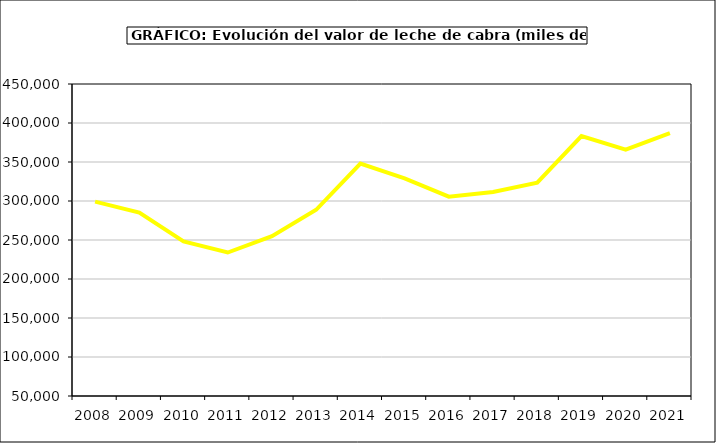
| Category | Leche de cabra |
|---|---|
| 2008.0 | 299168.815 |
| 2009.0 | 285112.802 |
| 2010.0 | 248183.34 |
| 2011.0 | 233957.713 |
| 2012.0 | 254951.239 |
| 2013.0 | 288752.444 |
| 2014.0 | 347968.832 |
| 2015.0 | 329025.351 |
| 2016.0 | 305546.706 |
| 2017.0 | 311526.524 |
| 2018.0 | 323450.218 |
| 2019.0 | 383309.693 |
| 2020.0 | 365968.19 |
| 2021.0 | 387094.92 |